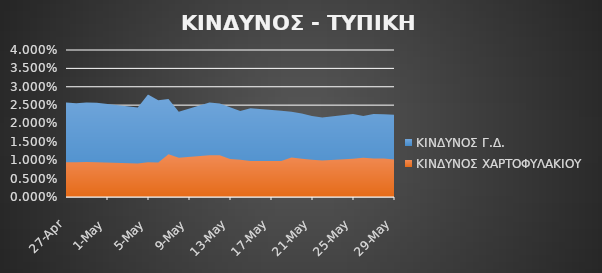
| Category | ΚΙΝΔΥΝΟΣ Γ.Δ. | ΚΙΝΔΥΝΟΣ ΧΑΡΤΟΦΥΛΑΚΙΟΥ |
|---|---|---|
| 2015-04-27 | 0.026 | 0.009 |
| 2015-04-28 | 0.026 | 0.009 |
| 2015-04-29 | 0.026 | 0.01 |
| 2015-04-30 | 0.026 | 0.009 |
| 2015-05-04 | 0.024 | 0.009 |
| 2015-05-05 | 0.028 | 0.009 |
| 2015-05-06 | 0.026 | 0.009 |
| 2015-05-07 | 0.027 | 0.012 |
| 2015-05-08 | 0.023 | 0.011 |
| 2015-05-11 | 0.026 | 0.011 |
| 2015-05-12 | 0.025 | 0.011 |
| 2015-05-13 | 0.024 | 0.01 |
| 2015-05-14 | 0.023 | 0.01 |
| 2015-05-15 | 0.024 | 0.01 |
| 2015-05-18 | 0.023 | 0.01 |
| 2015-05-19 | 0.023 | 0.011 |
| 2015-05-20 | 0.023 | 0.01 |
| 2015-05-21 | 0.022 | 0.01 |
| 2015-05-22 | 0.022 | 0.01 |
| 2015-05-25 | 0.023 | 0.01 |
| 2015-05-26 | 0.022 | 0.011 |
| 2015-05-27 | 0.023 | 0.01 |
| 2015-05-28 | 0.023 | 0.01 |
| 2015-05-29 | 0.022 | 0.01 |